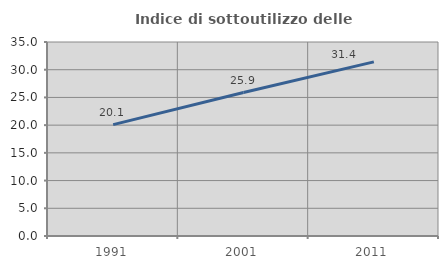
| Category | Indice di sottoutilizzo delle abitazioni  |
|---|---|
| 1991.0 | 20.09 |
| 2001.0 | 25.888 |
| 2011.0 | 31.42 |